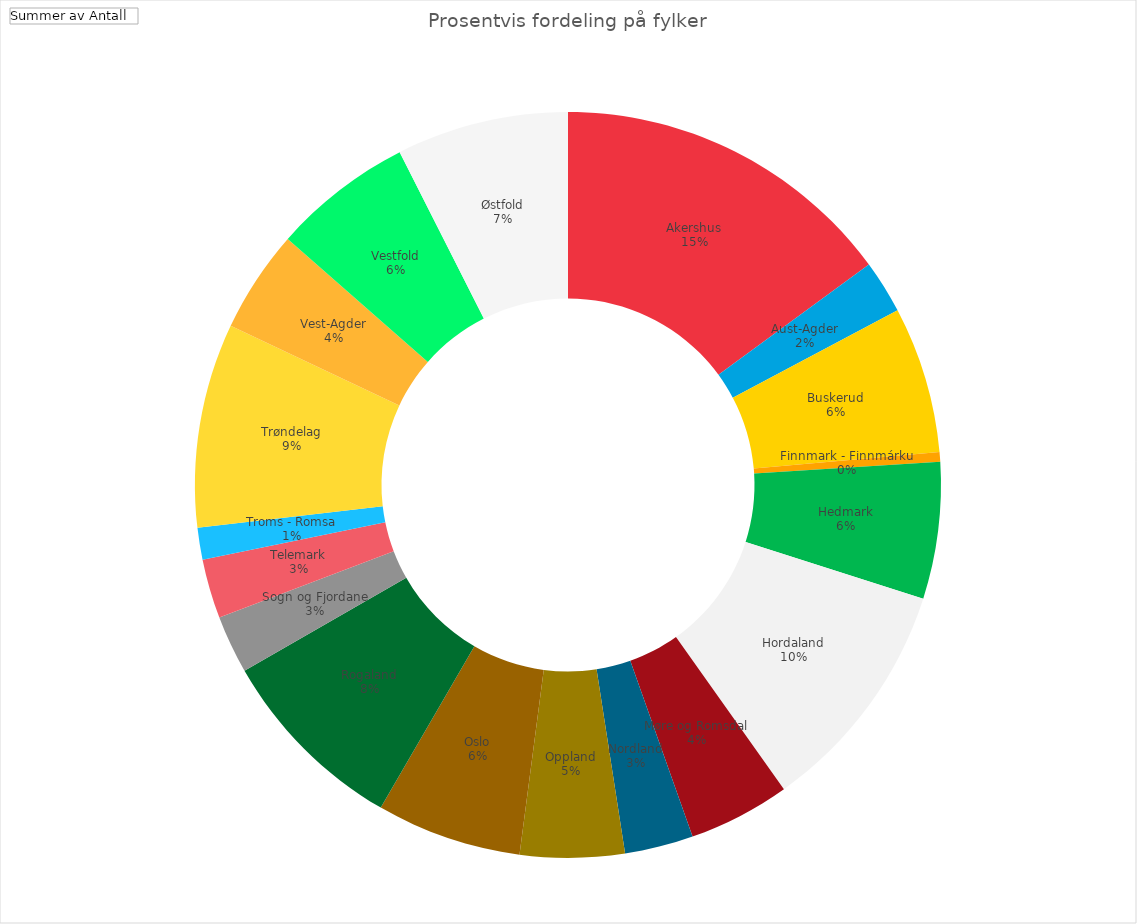
| Category | Totalt |
|---|---|
| Akershus | 2101 |
| Aust-Agder | 324 |
| Buskerud | 892 |
| Finnmark - Finnmárku | 60 |
| Hedmark | 833 |
| Hordaland | 1440 |
| Møre og Romsdal | 620 |
| Nordland | 418 |
| Oppland | 636 |
| Oslo | 885 |
| Rogaland | 1173 |
| Sogn og Fjordane | 353 |
| Telemark | 362 |
| Troms - Romsa | 194 |
| Trøndelag | 1244 |
| Vest-Agder | 626 |
| Vestfold | 855 |
| Østfold | 1048 |